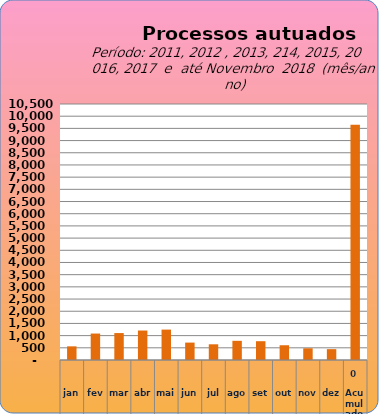
| Category | 6735 |
|---|---|
| jan | 560 |
| fev | 1085 |
| mar | 1105 |
| abr | 1209 |
| mai | 1247 |
| jun | 714 |
| jul | 644 |
| ago | 787 |
| set | 771 |
| out | 605 |
| nov | 480 |
| dez | 445 |
| Acumulado
 | 9652 |